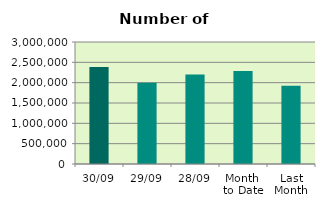
| Category | Series 0 |
|---|---|
| 30/09 | 2387900 |
| 29/09 | 2000046 |
| 28/09 | 2202388 |
| Month 
to Date | 2288803 |
| Last
Month | 1925290.095 |